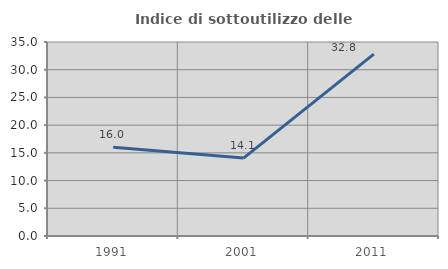
| Category | Indice di sottoutilizzo delle abitazioni  |
|---|---|
| 1991.0 | 16 |
| 2001.0 | 14.056 |
| 2011.0 | 32.812 |